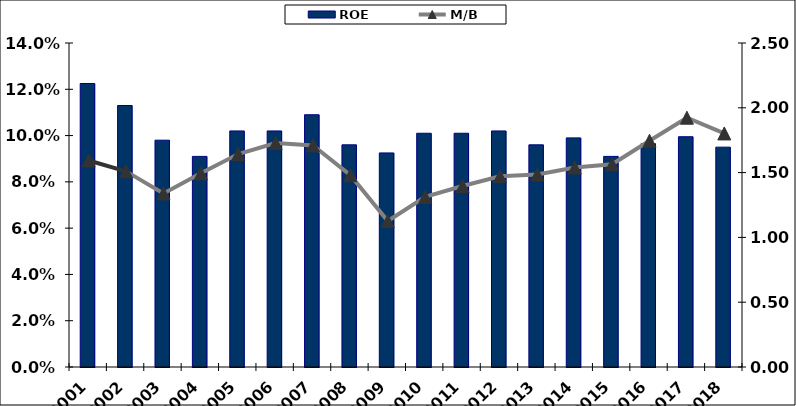
| Category | ROE |
|---|---|
| 2001.0 | 0.122 |
| 2002.0 | 0.113 |
| 2003.0 | 0.098 |
| 2004.0 | 0.091 |
| 2005.0 | 0.102 |
| 2006.0 | 0.102 |
| 2007.0 | 0.109 |
| 2008.0 | 0.096 |
| 2009.0 | 0.092 |
| 2010.0 | 0.101 |
| 2011.0 | 0.101 |
| 2012.0 | 0.102 |
| 2013.0 | 0.096 |
| 2014.0 | 0.099 |
| 2015.0 | 0.091 |
| 2016.0 | 0.096 |
| 2017.0 | 0.1 |
| 2018.0 | 0.095 |